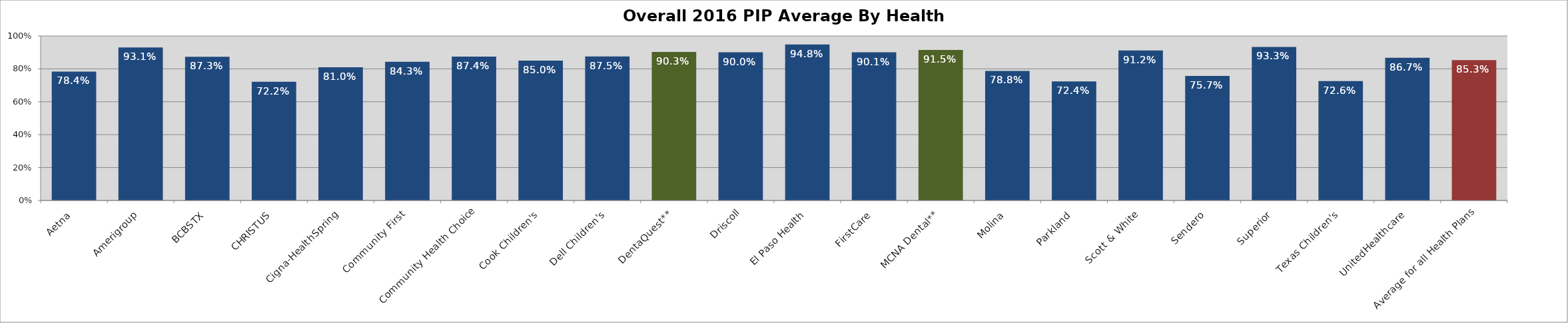
| Category | Overall Average* |
|---|---|
| Aetna | 0.784 |
| Amerigroup | 0.931 |
| BCBSTX | 0.873 |
| CHRISTUS | 0.722 |
| Cigna-HealthSpring | 0.81 |
| Community First | 0.843 |
| Community Health Choice | 0.874 |
| Cook Children's | 0.85 |
| Dell Children's | 0.875 |
| DentaQuest** | 0.903 |
| Driscoll | 0.9 |
| El Paso Health | 0.948 |
| FirstCare | 0.901 |
| MCNA Dental** | 0.915 |
| Molina | 0.788 |
| Parkland | 0.724 |
| Scott & White | 0.912 |
| Sendero | 0.757 |
| Superior | 0.933 |
| Texas Children's | 0.726 |
| UnitedHealthcare | 0.867 |
| Average for all Health Plans | 0.853 |